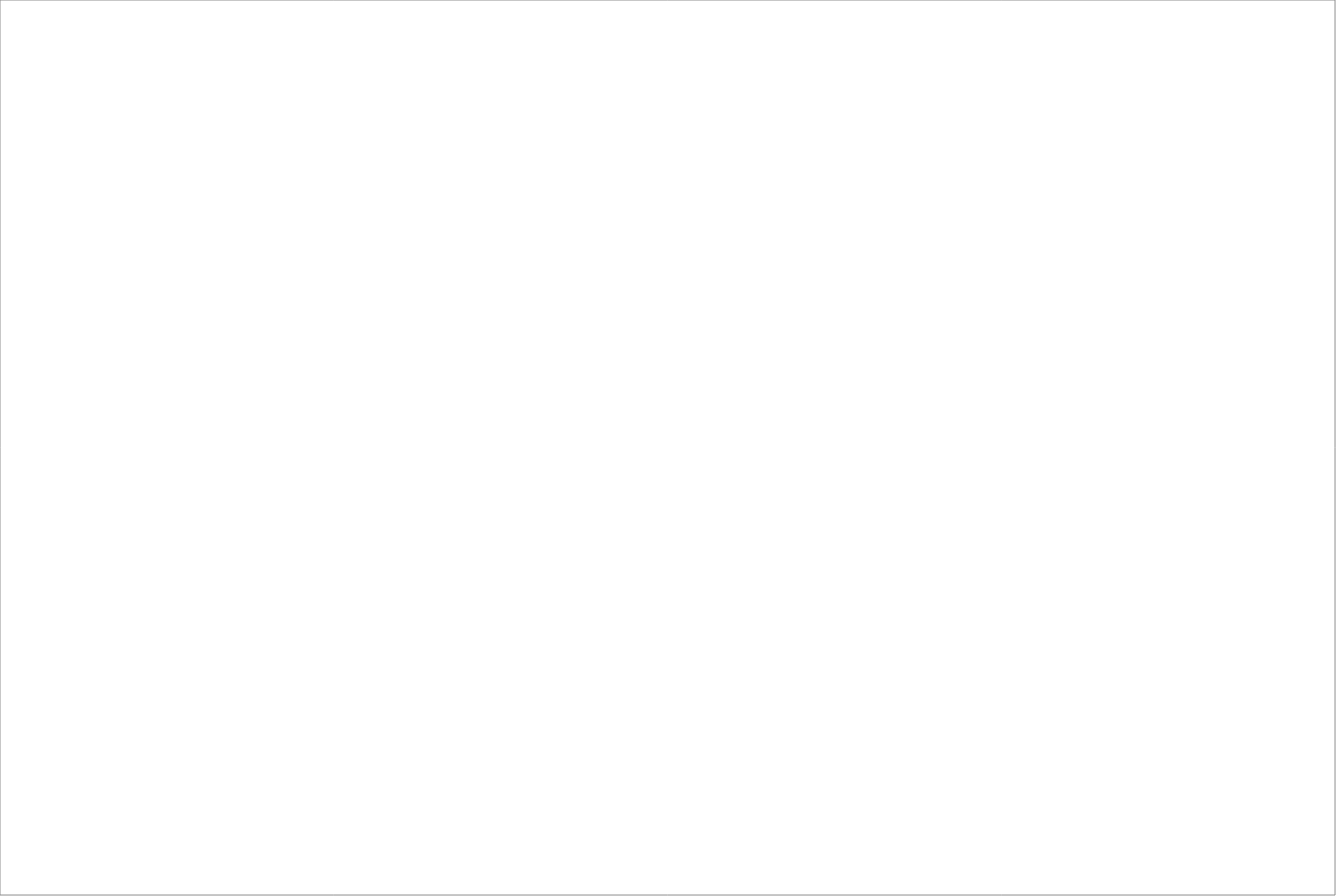
| Category | Total |
|---|---|
| Randstad AB | 77.5 |
| AB Effektiv Borås AB | 77.5 |
| Poolia Sverige Aktiebolag | 65 |
| StudentConsulting Sweden AB | 65 |
| Academic Work Sweden AB | 62.5 |